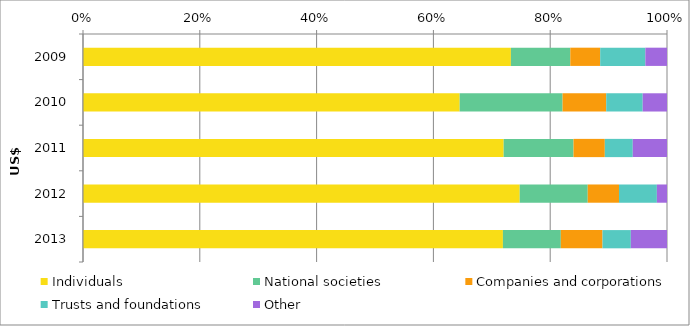
| Category | Individuals | National societies | Companies and corporations | Trusts and foundations | Other |
|---|---|---|---|---|---|
| 2009.0 | 0.733 | 0.102 | 0.051 | 0.077 | 0.037 |
| 2010.0 | 0.645 | 0.176 | 0.075 | 0.062 | 0.042 |
| 2011.0 | 0.72 | 0.12 | 0.054 | 0.048 | 0.059 |
| 2012.0 | 0.748 | 0.116 | 0.054 | 0.065 | 0.017 |
| 2013.0 | 0.719 | 0.099 | 0.071 | 0.048 | 0.062 |